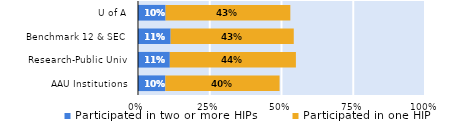
| Category | Participated in two or more HIPs | Participated in one HIP |
|---|---|---|
| AAU Institutions | 0.095 | 0.398 |
| Research-Public Univ | 0.111 | 0.439 |
| Benchmark 12 & SEC | 0.114 | 0.429 |
| U of A | 0.096 | 0.435 |